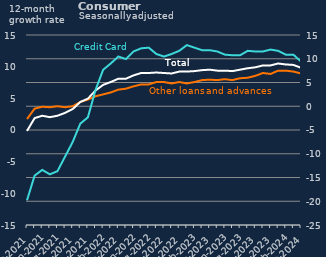
| Category | Other loans and advances | Total |
|---|---|---|
| Apr-2021 | -2.7 | -5.2 |
| May-2021 | -0.5 | -2.5 |
| Jun-2021 | -0.1 | -2 |
| Jul-2021 | -0.2 | -2.3 |
| Aug-2021 | 0 | -2 |
| Sep-2021 | -0.2 | -1.4 |
| Oct-2021 | 0 | -0.6 |
| Nov-2021 | 0.9 | 0.9 |
| Dec-2021 | 1.4 | 1.6 |
| Jan-2022 | 2.1 | 3.3 |
| Feb-2022 | 2.5 | 4.5 |
| Mar-2022 | 2.9 | 5.1 |
| Apr-2022 | 3.5 | 5.8 |
| May-2022 | 3.7 | 5.8 |
| Jun-2022 | 4.2 | 6.5 |
| Jul-2022 | 4.6 | 7 |
| Aug-2022 | 4.6 | 7 |
| Sep-2022 | 5.1 | 7.1 |
| Oct-2022 | 5.1 | 7 |
| Nov-2022 | 4.8 | 6.9 |
| Dec-2022 | 5.1 | 7.3 |
| Jan-2023 | 4.8 | 7.3 |
| Feb-2023 | 5.1 | 7.4 |
| Mar-2023 | 5.5 | 7.6 |
| Apr-2023 | 5.6 | 7.7 |
| May-2023 | 5.5 | 7.5 |
| Jun-2023 | 5.7 | 7.5 |
| Jul-2023 | 5.5 | 7.4 |
| Aug-2023 | 5.9 | 7.7 |
| Sep-2023 | 6 | 8 |
| Oct-2023 | 6.4 | 8.2 |
| Nov-2023 | 7 | 8.6 |
| Dec-2023 | 6.8 | 8.6 |
| Jan-2024 | 7.5 | 9 |
| Feb-2024 | 7.5 | 8.8 |
| Mar-2024 | 7.3 | 8.7 |
| Apr-2024 | 6.9 | 8.1 |